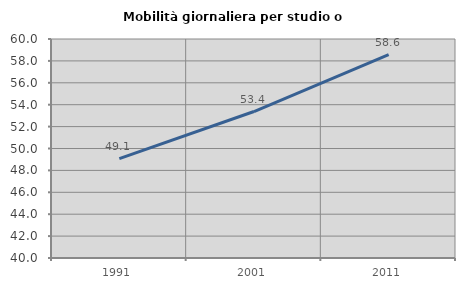
| Category | Mobilità giornaliera per studio o lavoro |
|---|---|
| 1991.0 | 49.079 |
| 2001.0 | 53.378 |
| 2011.0 | 58.579 |